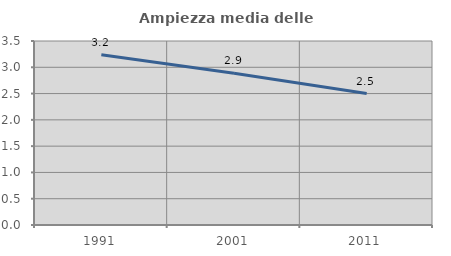
| Category | Ampiezza media delle famiglie |
|---|---|
| 1991.0 | 3.238 |
| 2001.0 | 2.888 |
| 2011.0 | 2.501 |